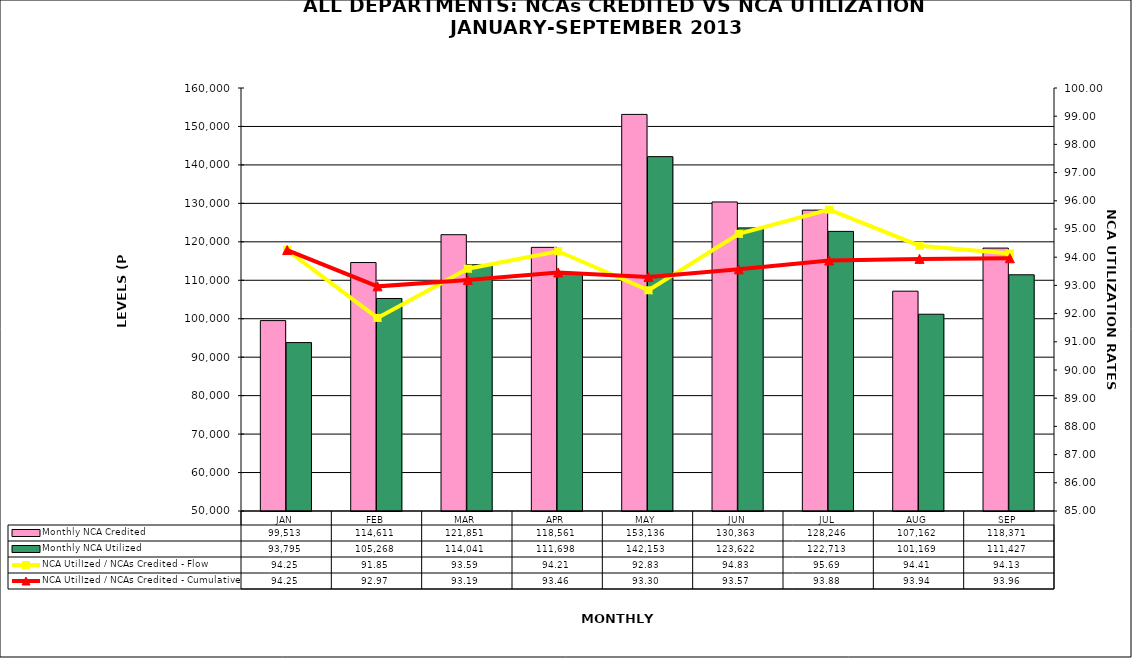
| Category | Monthly NCA Credited | Monthly NCA Utilized |
|---|---|---|
| JAN | 99513.083 | 93795.169 |
| FEB | 114611.135 | 105267.676 |
| MAR | 121850.757 | 114041.352 |
| APR | 118560.897 | 111698.077 |
| MAY | 153136.136 | 142152.808 |
| JUN | 130363.295 | 123621.517 |
| JUL | 128245.743 | 122712.666 |
| AUG | 107161.983 | 101168.76 |
| SEP | 118370.953 | 111426.749 |